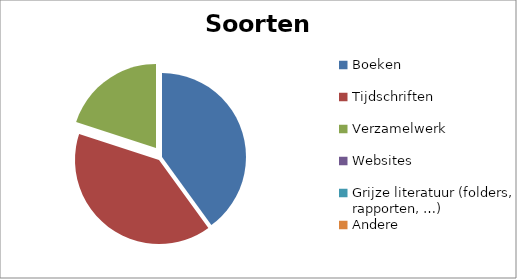
| Category | Procent |
|---|---|
| Boeken | 40 |
| Tijdschriften | 40 |
| Verzamelwerk | 20 |
| Websites | 0 |
| Grijze literatuur (folders, rapporten, …) | 0 |
| Andere | 0 |